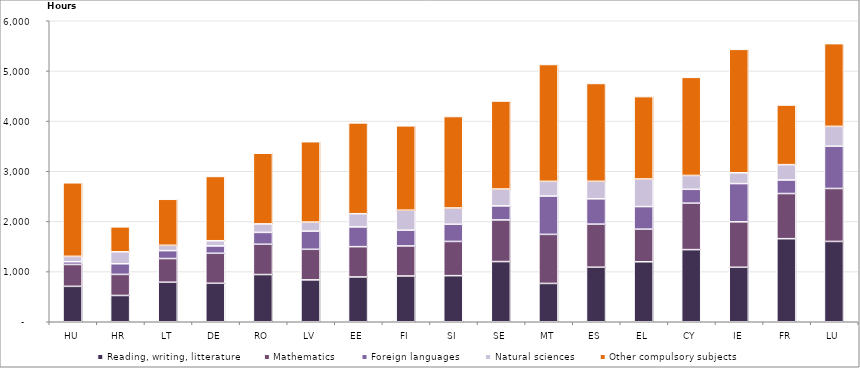
| Category | Reading, writing, litterature | Mathematics | Foreign languages | Natural sciences | Other compulsory subjects |
|---|---|---|---|---|---|
| HU | 706 | 436 | 54 | 108 | 1466 |
| HR | 524 | 420 | 212 | 238 | 498 |
| LT | 788 | 472 | 158 | 106 | 917 |
| DE | 767 | 598 | 147 | 103 | 1281 |
| RO | 941 | 604 | 236 | 170 | 1409 |
| LV | 835 | 609 | 362 | 181 | 1602 |
| EE | 893 | 604 | 394 | 263 | 1810 |
| FI | 912 | 599 | 314 | 399 | 1681 |
| SI | 919 | 682 | 343 | 324 | 1823 |
| SE | 1200 | 830 | 280 | 336 | 1754 |
| MT | 764 | 978 | 764 | 293 | 2329 |
| ES | 1087 | 859 | 505 | 349 | 1950 |
| EL | 1196 | 650 | 450 | 550 | 1642 |
| CY | 1438 | 926 | 276 | 276 | 1956 |
| IE | 1086 | 906 | 762 | 216 | 2460 |
| FR | 1656 | 900 | 270 | 306 | 1188 |
| LU | 1601 | 1056 | 842 | 396 | 1649 |